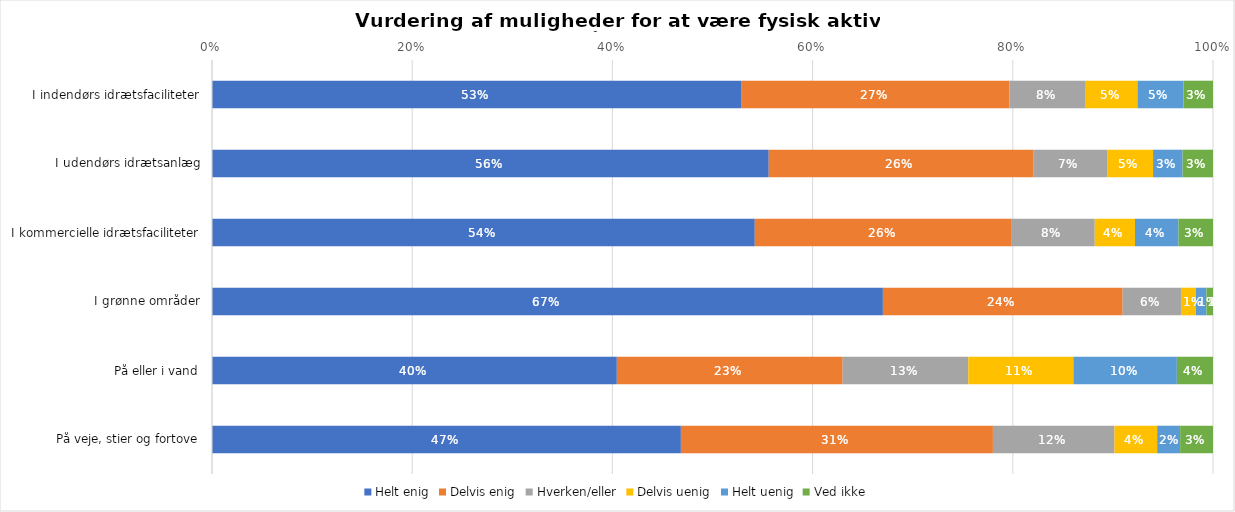
| Category | Helt enig | Delvis enig | Hverken/eller | Delvis uenig | Helt uenig | Ved ikke |
|---|---|---|---|---|---|---|
| I indendørs idrætsfaciliteter | 0.529 | 0.267 | 0.076 | 0.052 | 0.046 | 0.03 |
| I udendørs idrætsanlæg | 0.556 | 0.264 | 0.074 | 0.046 | 0.03 | 0.03 |
| I kommercielle idrætsfaciliteter | 0.542 | 0.257 | 0.083 | 0.04 | 0.043 | 0.034 |
| I grønne områder | 0.67 | 0.24 | 0.058 | 0.015 | 0.011 | 0.007 |
| På eller i vand | 0.404 | 0.226 | 0.126 | 0.105 | 0.103 | 0.036 |
| På veje, stier og fortove | 0.468 | 0.312 | 0.121 | 0.043 | 0.023 | 0.033 |